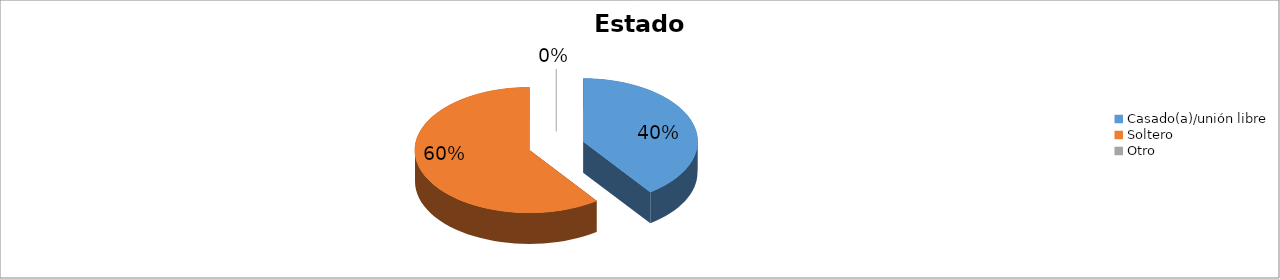
| Category | Series 0 |
|---|---|
| Casado(a)/unión libre | 0.4 |
| Soltero | 0.6 |
| Otro | 0 |